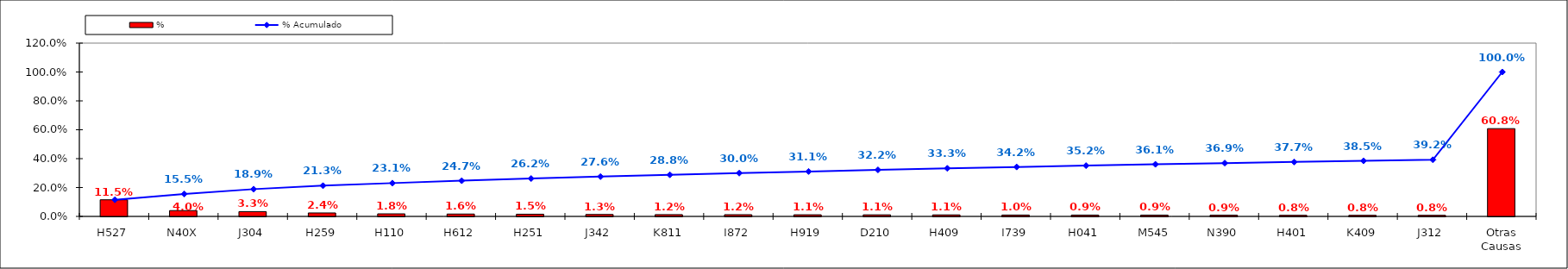
| Category | % |
|---|---|
| H527 | 0.115 |
| N40X | 0.04 |
| J304 | 0.033 |
| H259 | 0.024 |
| H110 | 0.018 |
| H612 | 0.016 |
| H251 | 0.015 |
| J342 | 0.013 |
| K811 | 0.012 |
| I872 | 0.012 |
| H919 | 0.011 |
| D210 | 0.011 |
| H409 | 0.011 |
| I739 | 0.01 |
| H041 | 0.009 |
| M545 | 0.009 |
| N390 | 0.009 |
| H401 | 0.008 |
| K409 | 0.008 |
| J312 | 0.008 |
| Otras Causas | 0.608 |